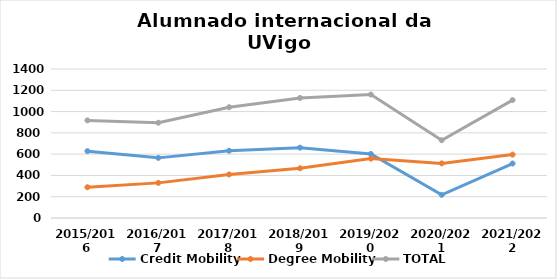
| Category | Credit Mobility | Degree Mobility | TOTAL |
|---|---|---|---|
| 2015/2016 | 628 | 289 | 917 |
| 2016/2017 | 565 | 330 | 895 |
| 2017/2018 | 632 | 409 | 1041 |
| 2018/2019 | 661 | 467 | 1128 |
| 2019/2020 | 602 | 558 | 1160 |
| 2020/2021 | 218 | 513 | 731 |
| 2021/2022 | 512 | 596 | 1108 |